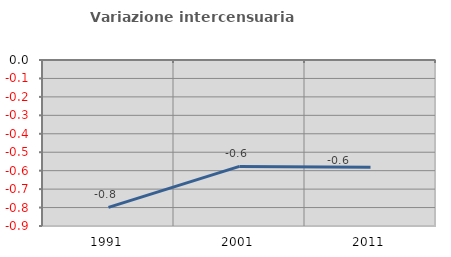
| Category | Variazione intercensuaria annua |
|---|---|
| 1991.0 | -0.799 |
| 2001.0 | -0.577 |
| 2011.0 | -0.582 |